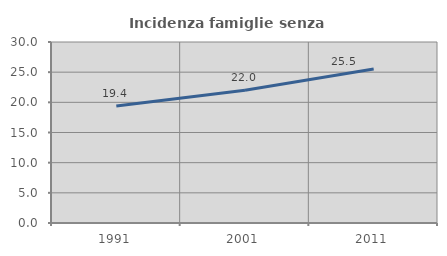
| Category | Incidenza famiglie senza nuclei |
|---|---|
| 1991.0 | 19.375 |
| 2001.0 | 21.999 |
| 2011.0 | 25.536 |